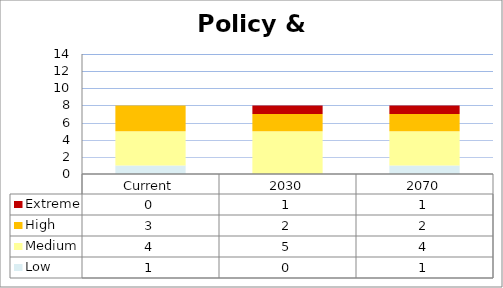
| Category | Low | Medium | High | Extreme |
|---|---|---|---|---|
| Current | 1 | 4 | 3 | 0 |
| 2030 | 0 | 5 | 2 | 1 |
| 2070 | 1 | 4 | 2 | 1 |